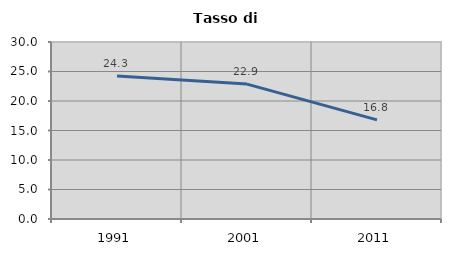
| Category | Tasso di disoccupazione   |
|---|---|
| 1991.0 | 24.252 |
| 2001.0 | 22.865 |
| 2011.0 | 16.797 |